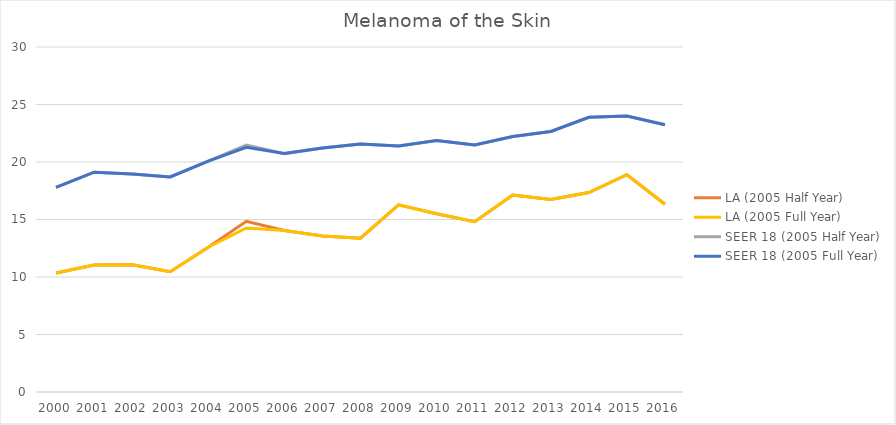
| Category | LA (2005 Half Year) | LA (2005 Full Year) | SEER 18 (2005 Half Year) | SEER 18 (2005 Full Year) |
|---|---|---|---|---|
| 2000.0 | 10.35 | 10.35 | 17.787 | 17.787 |
| 2001.0 | 11.037 | 11.037 | 19.111 | 19.111 |
| 2002.0 | 11.074 | 11.074 | 18.965 | 18.965 |
| 2003.0 | 10.466 | 10.466 | 18.702 | 18.702 |
| 2004.0 | 12.59 | 12.59 | 20.079 | 20.079 |
| 2005.0 | 14.845 | 14.26 | 21.48 | 21.275 |
| 2006.0 | 14.05 | 14.05 | 20.73 | 20.73 |
| 2007.0 | 13.574 | 13.574 | 21.216 | 21.216 |
| 2008.0 | 13.375 | 13.375 | 21.564 | 21.564 |
| 2009.0 | 16.28 | 16.28 | 21.398 | 21.398 |
| 2010.0 | 15.505 | 15.505 | 21.859 | 21.859 |
| 2011.0 | 14.814 | 14.814 | 21.486 | 21.486 |
| 2012.0 | 17.129 | 17.129 | 22.223 | 22.223 |
| 2013.0 | 16.742 | 16.742 | 22.66 | 22.66 |
| 2014.0 | 17.349 | 17.349 | 23.888 | 23.888 |
| 2015.0 | 18.893 | 18.893 | 24.004 | 24.004 |
| 2016.0 | 16.329 | 16.329 | 23.233 | 23.233 |